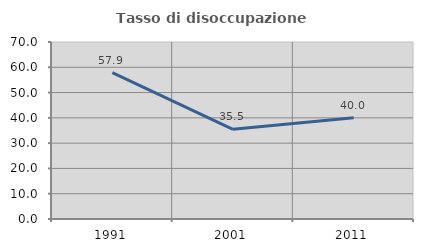
| Category | Tasso di disoccupazione giovanile  |
|---|---|
| 1991.0 | 57.895 |
| 2001.0 | 35.484 |
| 2011.0 | 40 |